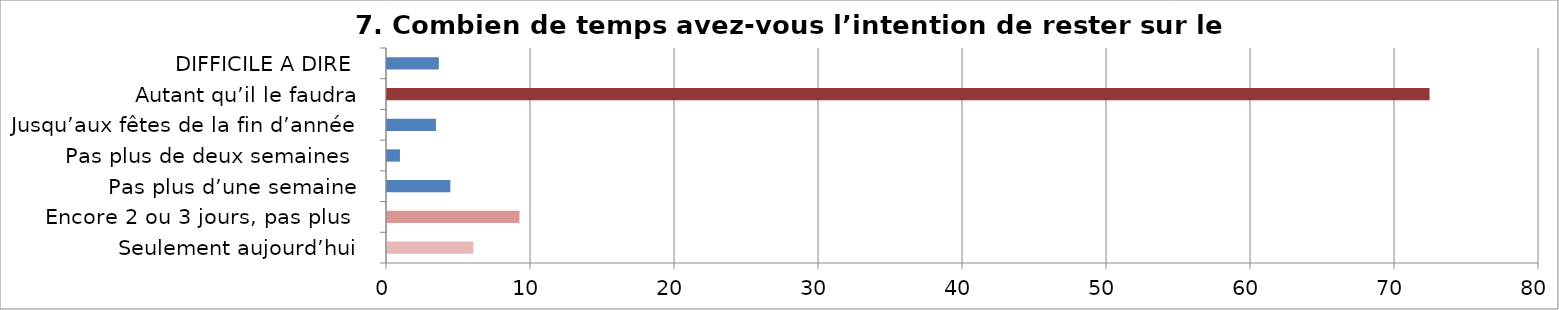
| Category | Series 0 |
|---|---|
| Seulement aujourd’hui | 6 |
| Encore 2 ou 3 jours, pas plus  | 9.2 |
| Pas plus d’une semaine | 4.4 |
| Pas plus de deux semaines  | 0.9 |
| Jusqu’aux fêtes de la fin d’année | 3.4 |
| Autant qu’il le faudra | 72.4 |
| DIFFICILE A DIRE  | 3.6 |